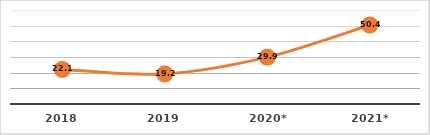
| Category | REPROBACIÓN (%)
PRIMER SEMESTRE, EJERCICIO 2021

 |
|---|---|
| 2018 | 22.1 |
| 2019 | 19.168 |
| 2020* | 29.9 |
| 2021* | 50.436 |